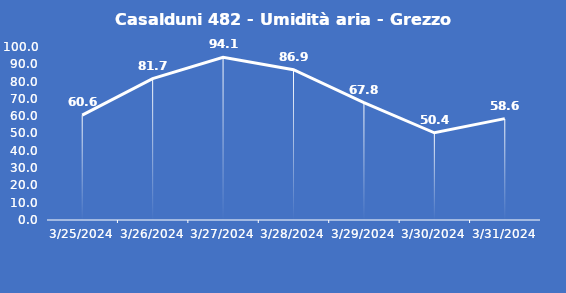
| Category | Casalduni 482 - Umidità aria - Grezzo (%) |
|---|---|
| 3/25/24 | 60.6 |
| 3/26/24 | 81.7 |
| 3/27/24 | 94.1 |
| 3/28/24 | 86.9 |
| 3/29/24 | 67.8 |
| 3/30/24 | 50.4 |
| 3/31/24 | 58.6 |